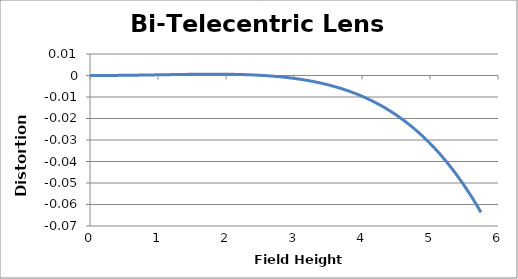
| Category | Distortion (%) |
|---|---|
| 0.0 | 0 |
| 0.0575 | 0 |
| 0.115 | 0 |
| 0.1725 | 0 |
| 0.23 | 0 |
| 0.2875 | 0 |
| 0.345 | 0 |
| 0.4025 | 0 |
| 0.46 | 0 |
| 0.5175 | 0 |
| 0.575 | 0 |
| 0.6325 | 0 |
| 0.69 | 0 |
| 0.7475 | 0 |
| 0.805 | 0 |
| 0.8625 | 0 |
| 0.92 | 0 |
| 0.9775 | 0 |
| 1.035 | 0 |
| 1.0925 | 0 |
| 1.15 | 0 |
| 1.2075 | 0 |
| 1.265 | 0 |
| 1.3225 | 0 |
| 1.38 | 0 |
| 1.4375 | 0.001 |
| 1.495 | 0.001 |
| 1.5525 | 0.001 |
| 1.61 | 0.001 |
| 1.6675 | 0.001 |
| 1.725 | 0.001 |
| 1.7825 | 0.001 |
| 1.84 | 0.001 |
| 1.8975 | 0.001 |
| 1.955 | 0.001 |
| 2.0125 | 0.001 |
| 2.07 | 0.001 |
| 2.1275 | 0.001 |
| 2.185 | 0 |
| 2.2425 | 0 |
| 2.3 | 0 |
| 2.3575 | 0 |
| 2.415 | 0 |
| 2.4725 | 0 |
| 2.53 | 0 |
| 2.5875 | 0 |
| 2.645 | 0 |
| 2.7025 | 0 |
| 2.76 | 0 |
| 2.8175 | -0.001 |
| 2.875 | -0.001 |
| 2.9325 | -0.001 |
| 2.99 | -0.001 |
| 3.0475 | -0.002 |
| 3.105 | -0.002 |
| 3.1625 | -0.002 |
| 3.22 | -0.002 |
| 3.2775 | -0.003 |
| 3.335 | -0.003 |
| 3.3925 | -0.004 |
| 3.45 | -0.004 |
| 3.5075 | -0.004 |
| 3.565 | -0.005 |
| 3.6225 | -0.005 |
| 3.68 | -0.006 |
| 3.7375 | -0.007 |
| 3.795 | -0.007 |
| 3.8525 | -0.008 |
| 3.91 | -0.008 |
| 3.9675 | -0.009 |
| 4.025 | -0.01 |
| 4.0825 | -0.011 |
| 4.14 | -0.012 |
| 4.1975 | -0.013 |
| 4.255 | -0.014 |
| 4.3125 | -0.015 |
| 4.37 | -0.016 |
| 4.4275 | -0.017 |
| 4.485 | -0.018 |
| 4.5425 | -0.019 |
| 4.6 | -0.021 |
| 4.6575 | -0.022 |
| 4.715 | -0.023 |
| 4.7725 | -0.025 |
| 4.83 | -0.026 |
| 4.8875 | -0.028 |
| 4.945 | -0.03 |
| 5.0025 | -0.032 |
| 5.06 | -0.034 |
| 5.1175 | -0.036 |
| 5.175 | -0.038 |
| 5.2325 | -0.04 |
| 5.29 | -0.042 |
| 5.3475 | -0.044 |
| 5.405 | -0.047 |
| 5.4625 | -0.049 |
| 5.52 | -0.052 |
| 5.5775 | -0.055 |
| 5.635 | -0.058 |
| 5.6925 | -0.061 |
| 5.75 | -0.064 |